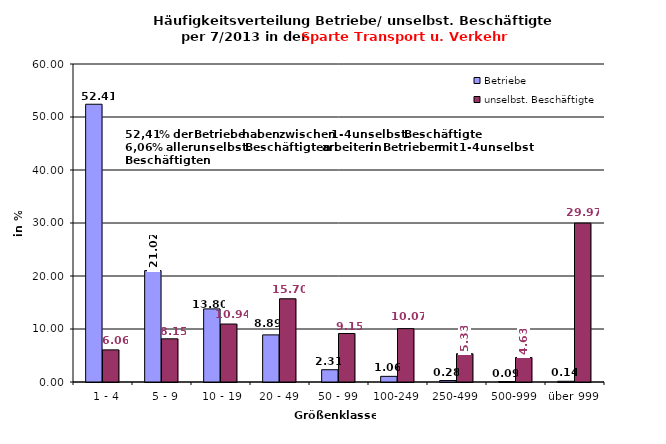
| Category | Betriebe | unselbst. Beschäftigte |
|---|---|---|
|   1 - 4 | 52.407 | 6.061 |
|   5 - 9 | 21.019 | 8.147 |
|  10 - 19 | 13.796 | 10.939 |
| 20 - 49 | 8.889 | 15.704 |
| 50 - 99 | 2.315 | 9.149 |
| 100-249 | 1.065 | 10.067 |
| 250-499 | 0.278 | 5.333 |
| 500-999 | 0.093 | 4.626 |
| über 999 | 0.139 | 29.974 |